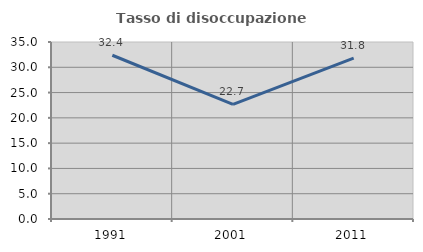
| Category | Tasso di disoccupazione giovanile  |
|---|---|
| 1991.0 | 32.38 |
| 2001.0 | 22.68 |
| 2011.0 | 31.826 |